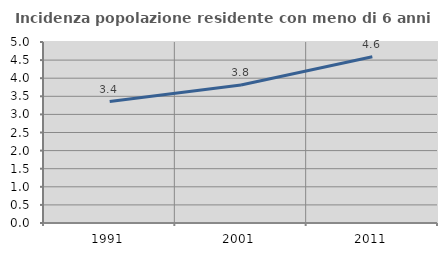
| Category | Incidenza popolazione residente con meno di 6 anni |
|---|---|
| 1991.0 | 3.354 |
| 2001.0 | 3.811 |
| 2011.0 | 4.591 |